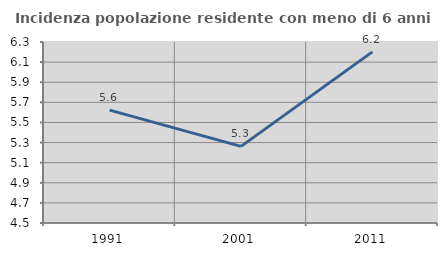
| Category | Incidenza popolazione residente con meno di 6 anni |
|---|---|
| 1991.0 | 5.623 |
| 2001.0 | 5.262 |
| 2011.0 | 6.202 |